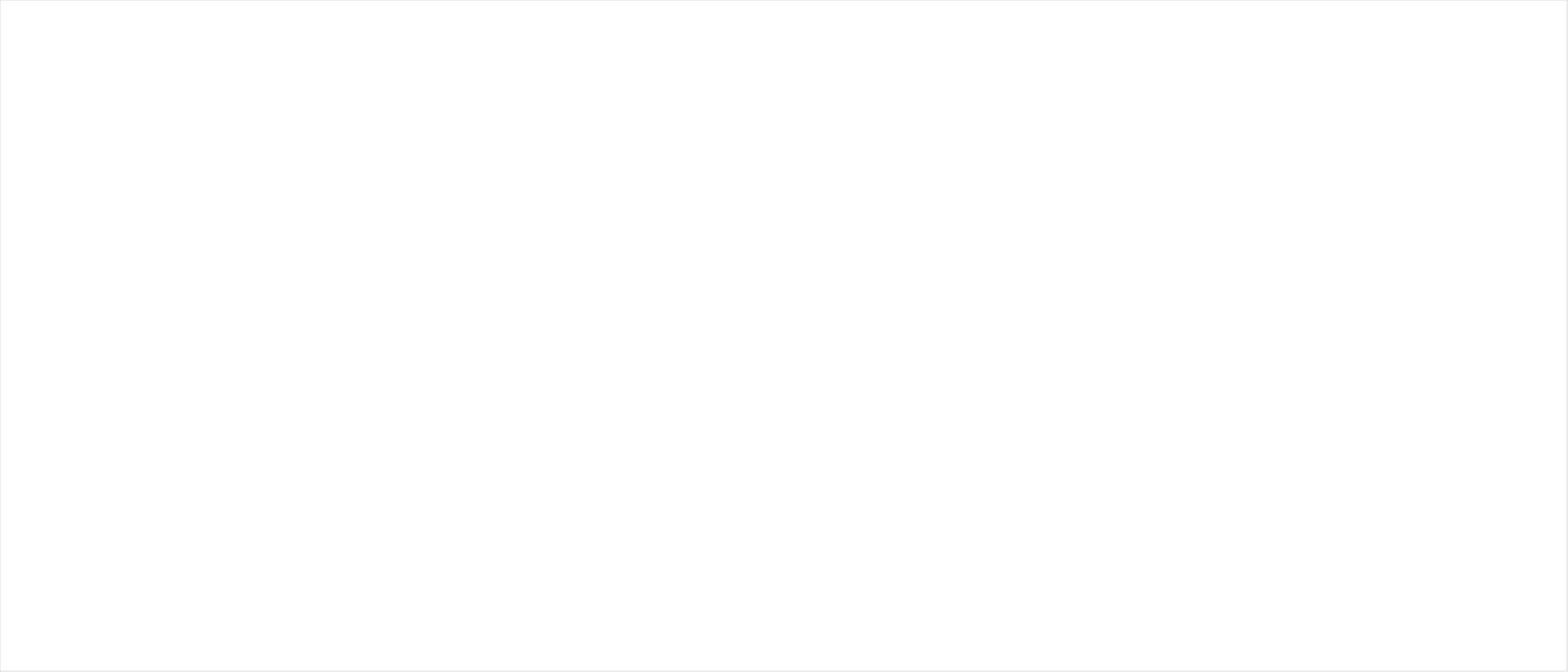
| Category | Series 0 |
|---|---|
| Music is embedded in the school | 0 |
| Meaningful delivery time in the curriculum. Children in primary school receive a minimum of one hour of music teaching a week; this may take the form of short sessions spread across the week | 0 |
| Music is planned, sequenced and taught as robustly as any other foundation subject | 0 |
| Music is part of a broad and balanced curriculum for all pupils | 0 |
| Music builds pupils’ cultural capital | 0 |
| Impact of music is evidenced | 0 |
| The school has coverage of National Curriculum requirements | 0 |
| Embedded a high-quality music education either by adopting the Model Music Curriculum, or implementing a curriculum that is at least comparable in breadth and ambition, covering the subject content set out in the national curriculum programmes of study | 0 |
| The school sequences learning across singing, listening, composing and performing/instrumental performance (a curriculum map for music) | 0 |
| Emphasis on sequencing learning in areas which, when taken together, contribute steadily towards pupils becoming more musical | 0 |
| Long and medium term overview plans in place and on record centrally so any teacher can see the context of the part they teach | 0 |
| The school has clarity on relevant and suitable assessment evident | 0 |
| Sing with accurate pitch in unison or harmony with attention to phrase and dynamics | 0 |
| Are capable of playing a simple melody on an instrument in an ensemble and to learn it from, for example, staff notation | 0 |
| Are able to create short phrases of new melodic music  | 0 |
| Demonstrate knowledge of music from a range of musical traditions  | 0 |
| Increasingly enjoy both their music lessons and are taking part in the wider musical life of the school | 0 |
| Music curriculum is developed and ideally delivered by a music specialist wherever possible, but where it isn’t possible, by a designated music lead, supported with appropriate training and connected to support from their local Music Hub.  | 0 |